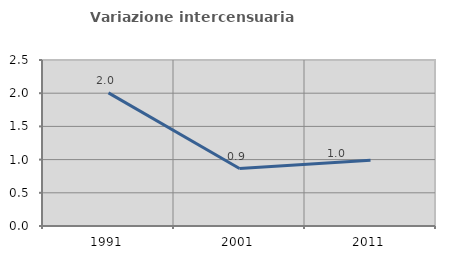
| Category | Variazione intercensuaria annua |
|---|---|
| 1991.0 | 2.004 |
| 2001.0 | 0.866 |
| 2011.0 | 0.99 |